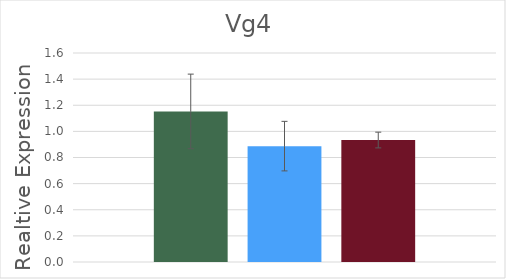
| Category | Control | Acetone | Hydroprene |
|---|---|---|---|
| Vg4 | 1.153 | 0.887 | 0.934 |